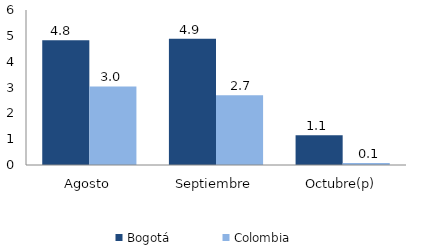
| Category | Bogotá | Colombia |
|---|---|---|
| Agosto | 4.831 | 3.039 |
| Septiembre | 4.884 | 2.705 |
| Octubre(p) | 1.147 | 0.076 |